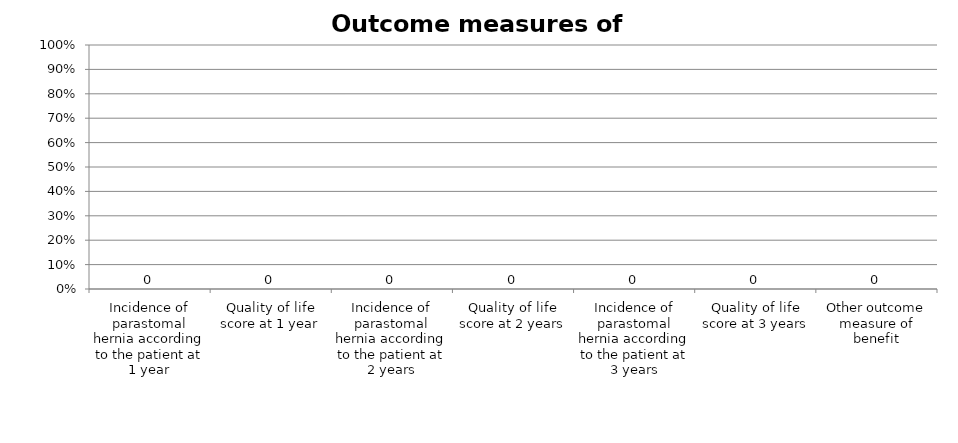
| Category | Series 0 |
|---|---|
| Incidence of parastomal hernia according to the patient at 1 year | 0 |
| Quality of life score at 1 year | 0 |
| Incidence of parastomal hernia according to the patient at 2 years | 0 |
| Quality of life score at 2 years | 0 |
| Incidence of parastomal hernia according to the patient at 3 years | 0 |
| Quality of life score at 3 years | 0 |
| Other outcome measure of benefit | 0 |